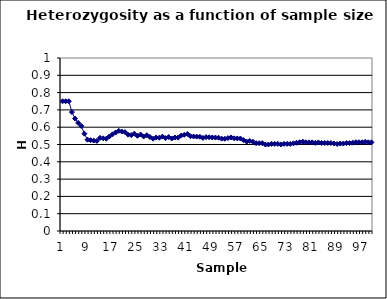
| Category | Series 0 |
|---|---|
| 0 | 0.75 |
| 1 | 0.75 |
| 2 | 0.75 |
| 3 | 0.688 |
| 4 | 0.65 |
| 5 | 0.625 |
| 6 | 0.607 |
| 7 | 0.562 |
| 8 | 0.528 |
| 9 | 0.525 |
| 10 | 0.523 |
| 11 | 0.521 |
| 12 | 0.538 |
| 13 | 0.536 |
| 14 | 0.533 |
| 15 | 0.547 |
| 16 | 0.559 |
| 17 | 0.569 |
| 18 | 0.579 |
| 19 | 0.575 |
| 20 | 0.571 |
| 21 | 0.557 |
| 22 | 0.554 |
| 23 | 0.562 |
| 24 | 0.55 |
| 25 | 0.558 |
| 26 | 0.546 |
| 27 | 0.554 |
| 28 | 0.543 |
| 29 | 0.533 |
| 30 | 0.54 |
| 31 | 0.539 |
| 32 | 0.545 |
| 33 | 0.537 |
| 34 | 0.543 |
| 35 | 0.535 |
| 36 | 0.541 |
| 37 | 0.539 |
| 38 | 0.551 |
| 39 | 0.556 |
| 40 | 0.561 |
| 41 | 0.548 |
| 42 | 0.547 |
| 43 | 0.545 |
| 44 | 0.544 |
| 45 | 0.538 |
| 46 | 0.543 |
| 47 | 0.542 |
| 48 | 0.541 |
| 49 | 0.54 |
| 50 | 0.539 |
| 51 | 0.534 |
| 52 | 0.533 |
| 53 | 0.537 |
| 54 | 0.541 |
| 55 | 0.536 |
| 56 | 0.535 |
| 57 | 0.534 |
| 58 | 0.525 |
| 59 | 0.517 |
| 60 | 0.52 |
| 61 | 0.516 |
| 62 | 0.508 |
| 63 | 0.508 |
| 64 | 0.508 |
| 65 | 0.5 |
| 66 | 0.5 |
| 67 | 0.504 |
| 68 | 0.504 |
| 69 | 0.504 |
| 70 | 0.5 |
| 71 | 0.503 |
| 72 | 0.503 |
| 73 | 0.503 |
| 74 | 0.507 |
| 75 | 0.51 |
| 76 | 0.513 |
| 77 | 0.516 |
| 78 | 0.513 |
| 79 | 0.513 |
| 80 | 0.512 |
| 81 | 0.509 |
| 82 | 0.512 |
| 83 | 0.509 |
| 84 | 0.509 |
| 85 | 0.509 |
| 86 | 0.509 |
| 87 | 0.506 |
| 88 | 0.503 |
| 89 | 0.506 |
| 90 | 0.505 |
| 91 | 0.508 |
| 92 | 0.508 |
| 93 | 0.511 |
| 94 | 0.513 |
| 95 | 0.513 |
| 96 | 0.513 |
| 97 | 0.515 |
| 98 | 0.513 |
| 99 | 0.512 |